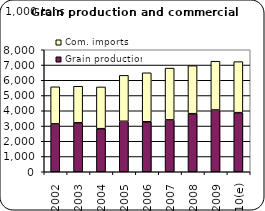
| Category | Grain production | Com. imports |
|---|---|---|
| 2002 | 3138.923 | 2431.809 |
| 2003 | 3209.989 | 2399.359 |
| 2004 | 2823.901 | 2739.539 |
| 2005 | 3309.942 | 3011.15 |
| 2006 | 3276.968 | 3213.739 |
| 2007 | 3400.967 | 3396.458 |
| 2008 | 3807.544 | 3148.666 |
| 2009 | 4050.156 | 3198.009 |
| 2010(e) | 3875.908 | 3345.605 |